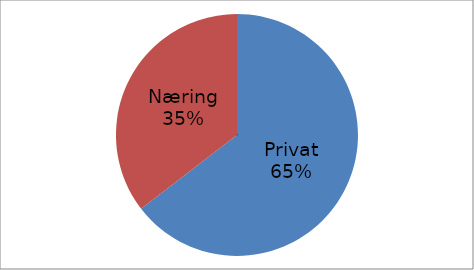
| Category | Series 0 |
|---|---|
| Privat | 37223492 |
| Næring | 20428031 |